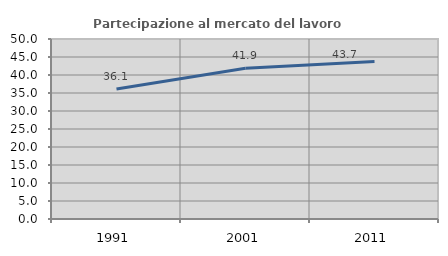
| Category | Partecipazione al mercato del lavoro  femminile |
|---|---|
| 1991.0 | 36.094 |
| 2001.0 | 41.858 |
| 2011.0 | 43.746 |